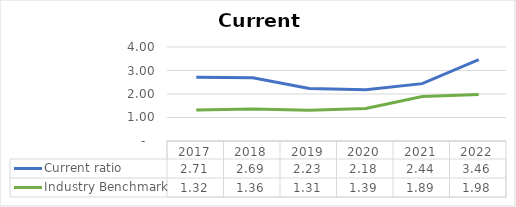
| Category | Current ratio | Industry Benchmark |
|---|---|---|
| 2017.0 | 2.715 | 1.32 |
| 2018.0 | 2.69 | 1.36 |
| 2019.0 | 2.231 | 1.31 |
| 2020.0 | 2.18 | 1.386 |
| 2021.0 | 2.441 | 1.892 |
| 2022.0 | 3.46 | 1.982 |